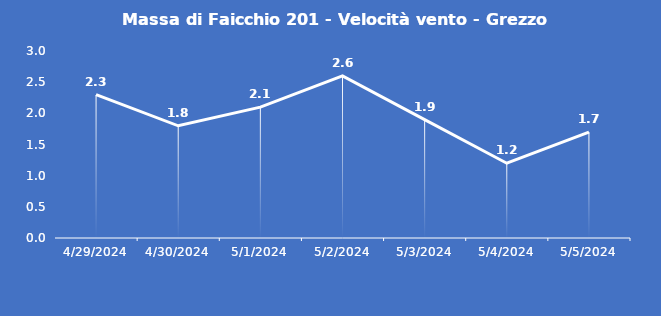
| Category | Massa di Faicchio 201 - Velocità vento - Grezzo (m/s) |
|---|---|
| 4/29/24 | 2.3 |
| 4/30/24 | 1.8 |
| 5/1/24 | 2.1 |
| 5/2/24 | 2.6 |
| 5/3/24 | 1.9 |
| 5/4/24 | 1.2 |
| 5/5/24 | 1.7 |